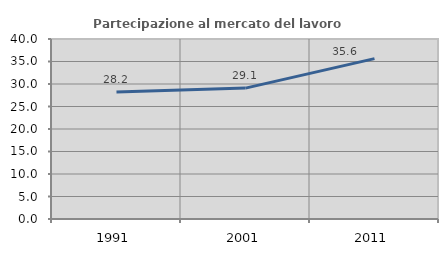
| Category | Partecipazione al mercato del lavoro  femminile |
|---|---|
| 1991.0 | 28.195 |
| 2001.0 | 29.09 |
| 2011.0 | 35.632 |